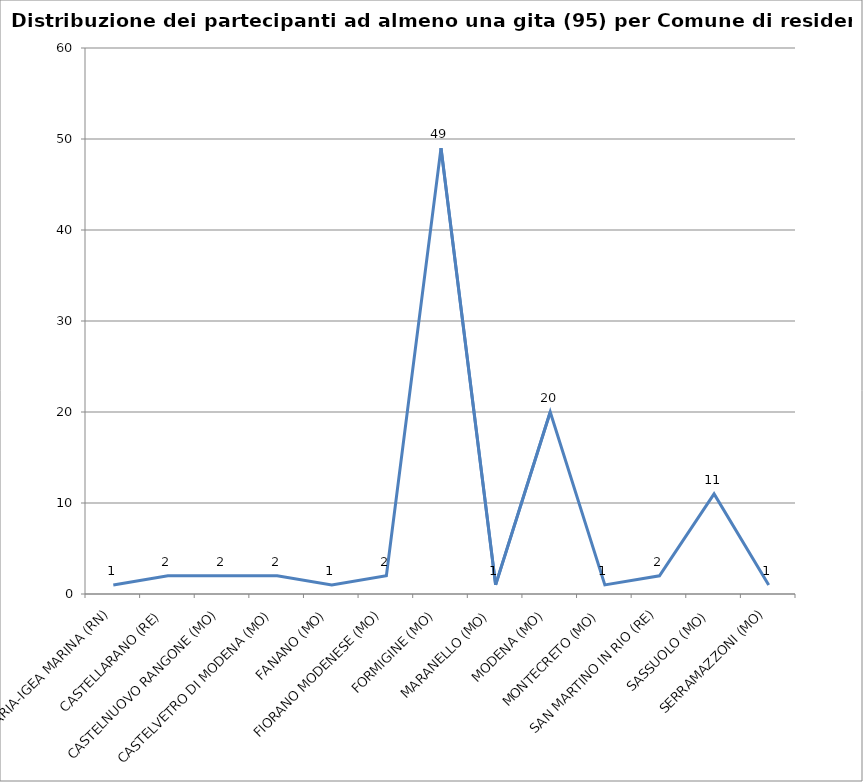
| Category | Nr. Tesserati |
|---|---|
| BELLARIA-IGEA MARINA (RN) | 1 |
| CASTELLARANO (RE) | 2 |
| CASTELNUOVO RANGONE (MO) | 2 |
| CASTELVETRO DI MODENA (MO) | 2 |
| FANANO (MO) | 1 |
| FIORANO MODENESE (MO) | 2 |
| FORMIGINE (MO) | 49 |
| MARANELLO (MO) | 1 |
| MODENA (MO) | 20 |
| MONTECRETO (MO) | 1 |
| SAN MARTINO IN RIO (RE) | 2 |
| SASSUOLO (MO) | 11 |
| SERRAMAZZONI (MO) | 1 |